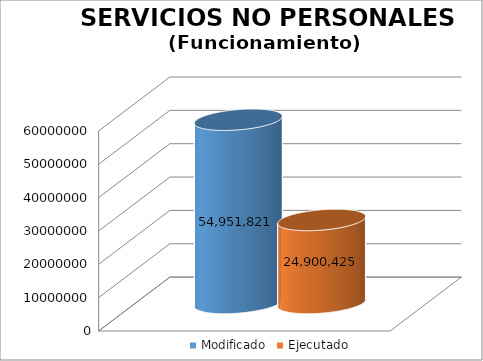
| Category | Modificado | Ejecutado |
|---|---|---|
| 0 | 54951821 | 24900424.74 |